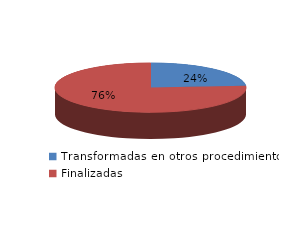
| Category | Series 0 |
|---|---|
| Transformadas en otros procedimientos | 10668 |
| Finalizadas | 34061 |